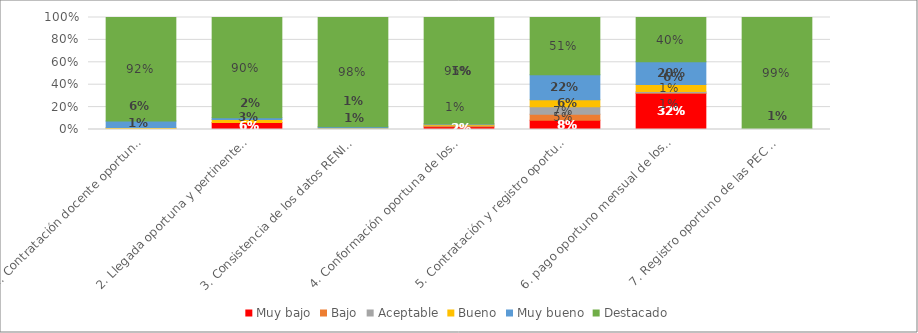
| Category | Muy bajo | Bajo | Aceptable | Bueno | Muy bueno | Destacado |
|---|---|---|---|---|---|---|
| 1. Contratación docente oportuna para el inicio del año escolar (DITEN)  | 0 | 0.005 | 0.005 | 0.009 | 0.057 | 0.924 |
| 2. Llegada oportuna y pertinente de materiales educativos a las II.EE, para el año escolar 2018 (UPP) | 0.062 | 0 | 0 | 0.026 | 0.016 | 0.896 |
| 3. Consistencia de los datos RENIEC-NEXUS-SUP (DITEN) | 0 | 0 | 0 | 0.014 | 0.009 | 0.976 |
| 4. Conformación oportuna de los comites de la evaluación ordinaria de Desempeño docente (DIED) | 0.024 | 0.009 | 0.005 | 0.009 | 0.005 | 0.948 |
| 5. Contratación y registro oportuno del personal CAS para las intervenciones prioritarias del sector educación (UPP) | 0.083 | 0.052 | 0.068 | 0.062 | 0.224 | 0.51 |
| 6. pago oportuno mensual de los servicios básicos de II.EE de EBR y EBE (UPP) | 0.323 | 0.005 | 0.01 | 0.062 | 0.203 | 0.396 |
| 7. Registro oportuno de las PEC de los PRONOEI (UPP) | 0 | 0 | 0 | 0 | 0.005 | 0.995 |